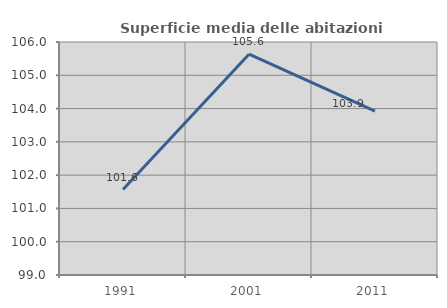
| Category | Superficie media delle abitazioni occupate |
|---|---|
| 1991.0 | 101.567 |
| 2001.0 | 105.633 |
| 2011.0 | 103.923 |